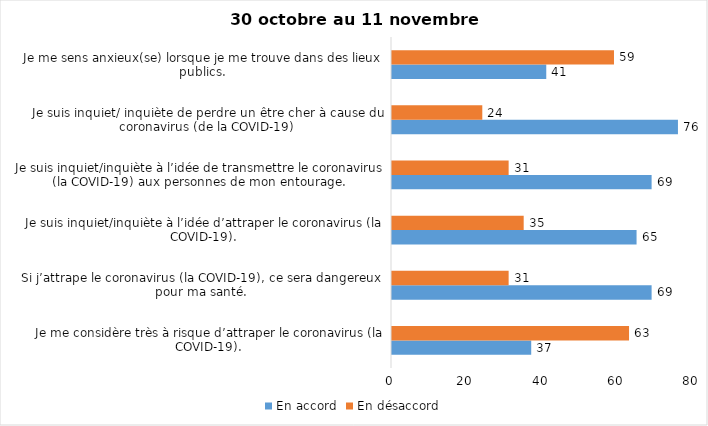
| Category | En accord | En désaccord |
|---|---|---|
| Je me considère très à risque d’attraper le coronavirus (la COVID-19). | 37 | 63 |
| Si j’attrape le coronavirus (la COVID-19), ce sera dangereux pour ma santé. | 69 | 31 |
| Je suis inquiet/inquiète à l’idée d’attraper le coronavirus (la COVID-19). | 65 | 35 |
| Je suis inquiet/inquiète à l’idée de transmettre le coronavirus (la COVID-19) aux personnes de mon entourage. | 69 | 31 |
| Je suis inquiet/ inquiète de perdre un être cher à cause du coronavirus (de la COVID-19) | 76 | 24 |
| Je me sens anxieux(se) lorsque je me trouve dans des lieux publics. | 41 | 59 |